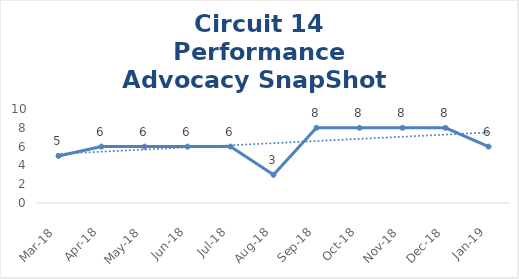
| Category | Circuit 14 |
|---|---|
| Mar-18 | 5 |
| Apr-18 | 6 |
| May-18 | 6 |
| Jun-18 | 6 |
| Jul-18 | 6 |
| Aug-18 | 3 |
| Sep-18 | 8 |
| Oct-18 | 8 |
| Nov-18 | 8 |
| Dec-18 | 8 |
| Jan-19 | 6 |